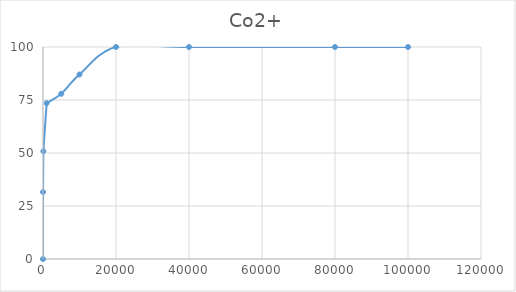
| Category | Co2+ |
|---|---|
| 1.0 | 0 |
| 10.0 | 31.592 |
| 100.0 | 50.831 |
| 1000.0 | 73.53 |
| 5000.0 | 77.931 |
| 10000.0 | 87.03 |
| 20000.0 | 100 |
| 40000.0 | 100 |
| 80000.0 | 100 |
| 100000.0 | 100 |